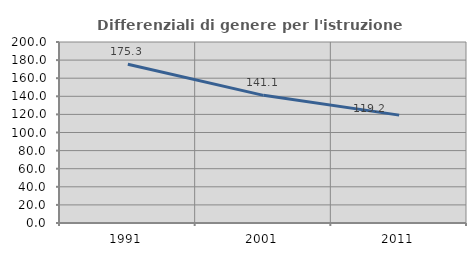
| Category | Differenziali di genere per l'istruzione superiore |
|---|---|
| 1991.0 | 175.345 |
| 2001.0 | 141.063 |
| 2011.0 | 119.184 |